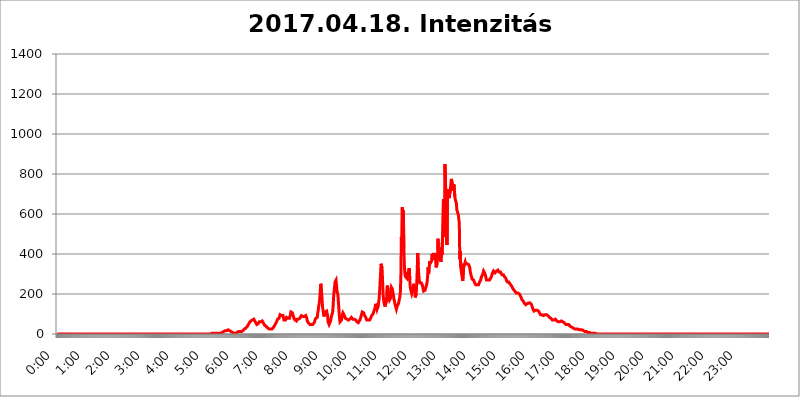
| Category | 2017.04.18. Intenzitás [W/m^2] |
|---|---|
| 0.0 | 0 |
| 0.0006944444444444445 | 0 |
| 0.001388888888888889 | 0 |
| 0.0020833333333333333 | 0 |
| 0.002777777777777778 | 0 |
| 0.003472222222222222 | 0 |
| 0.004166666666666667 | 0 |
| 0.004861111111111111 | 0 |
| 0.005555555555555556 | 0 |
| 0.0062499999999999995 | 0 |
| 0.006944444444444444 | 0 |
| 0.007638888888888889 | 0 |
| 0.008333333333333333 | 0 |
| 0.009027777777777779 | 0 |
| 0.009722222222222222 | 0 |
| 0.010416666666666666 | 0 |
| 0.011111111111111112 | 0 |
| 0.011805555555555555 | 0 |
| 0.012499999999999999 | 0 |
| 0.013194444444444444 | 0 |
| 0.013888888888888888 | 0 |
| 0.014583333333333332 | 0 |
| 0.015277777777777777 | 0 |
| 0.015972222222222224 | 0 |
| 0.016666666666666666 | 0 |
| 0.017361111111111112 | 0 |
| 0.018055555555555557 | 0 |
| 0.01875 | 0 |
| 0.019444444444444445 | 0 |
| 0.02013888888888889 | 0 |
| 0.020833333333333332 | 0 |
| 0.02152777777777778 | 0 |
| 0.022222222222222223 | 0 |
| 0.02291666666666667 | 0 |
| 0.02361111111111111 | 0 |
| 0.024305555555555556 | 0 |
| 0.024999999999999998 | 0 |
| 0.025694444444444447 | 0 |
| 0.02638888888888889 | 0 |
| 0.027083333333333334 | 0 |
| 0.027777777777777776 | 0 |
| 0.02847222222222222 | 0 |
| 0.029166666666666664 | 0 |
| 0.029861111111111113 | 0 |
| 0.030555555555555555 | 0 |
| 0.03125 | 0 |
| 0.03194444444444445 | 0 |
| 0.03263888888888889 | 0 |
| 0.03333333333333333 | 0 |
| 0.034027777777777775 | 0 |
| 0.034722222222222224 | 0 |
| 0.035416666666666666 | 0 |
| 0.036111111111111115 | 0 |
| 0.03680555555555556 | 0 |
| 0.0375 | 0 |
| 0.03819444444444444 | 0 |
| 0.03888888888888889 | 0 |
| 0.03958333333333333 | 0 |
| 0.04027777777777778 | 0 |
| 0.04097222222222222 | 0 |
| 0.041666666666666664 | 0 |
| 0.042361111111111106 | 0 |
| 0.04305555555555556 | 0 |
| 0.043750000000000004 | 0 |
| 0.044444444444444446 | 0 |
| 0.04513888888888889 | 0 |
| 0.04583333333333334 | 0 |
| 0.04652777777777778 | 0 |
| 0.04722222222222222 | 0 |
| 0.04791666666666666 | 0 |
| 0.04861111111111111 | 0 |
| 0.049305555555555554 | 0 |
| 0.049999999999999996 | 0 |
| 0.05069444444444445 | 0 |
| 0.051388888888888894 | 0 |
| 0.052083333333333336 | 0 |
| 0.05277777777777778 | 0 |
| 0.05347222222222222 | 0 |
| 0.05416666666666667 | 0 |
| 0.05486111111111111 | 0 |
| 0.05555555555555555 | 0 |
| 0.05625 | 0 |
| 0.05694444444444444 | 0 |
| 0.057638888888888885 | 0 |
| 0.05833333333333333 | 0 |
| 0.05902777777777778 | 0 |
| 0.059722222222222225 | 0 |
| 0.06041666666666667 | 0 |
| 0.061111111111111116 | 0 |
| 0.06180555555555556 | 0 |
| 0.0625 | 0 |
| 0.06319444444444444 | 0 |
| 0.06388888888888888 | 0 |
| 0.06458333333333334 | 0 |
| 0.06527777777777778 | 0 |
| 0.06597222222222222 | 0 |
| 0.06666666666666667 | 0 |
| 0.06736111111111111 | 0 |
| 0.06805555555555555 | 0 |
| 0.06874999999999999 | 0 |
| 0.06944444444444443 | 0 |
| 0.07013888888888889 | 0 |
| 0.07083333333333333 | 0 |
| 0.07152777777777779 | 0 |
| 0.07222222222222223 | 0 |
| 0.07291666666666667 | 0 |
| 0.07361111111111111 | 0 |
| 0.07430555555555556 | 0 |
| 0.075 | 0 |
| 0.07569444444444444 | 0 |
| 0.0763888888888889 | 0 |
| 0.07708333333333334 | 0 |
| 0.07777777777777778 | 0 |
| 0.07847222222222222 | 0 |
| 0.07916666666666666 | 0 |
| 0.0798611111111111 | 0 |
| 0.08055555555555556 | 0 |
| 0.08125 | 0 |
| 0.08194444444444444 | 0 |
| 0.08263888888888889 | 0 |
| 0.08333333333333333 | 0 |
| 0.08402777777777777 | 0 |
| 0.08472222222222221 | 0 |
| 0.08541666666666665 | 0 |
| 0.08611111111111112 | 0 |
| 0.08680555555555557 | 0 |
| 0.08750000000000001 | 0 |
| 0.08819444444444445 | 0 |
| 0.08888888888888889 | 0 |
| 0.08958333333333333 | 0 |
| 0.09027777777777778 | 0 |
| 0.09097222222222222 | 0 |
| 0.09166666666666667 | 0 |
| 0.09236111111111112 | 0 |
| 0.09305555555555556 | 0 |
| 0.09375 | 0 |
| 0.09444444444444444 | 0 |
| 0.09513888888888888 | 0 |
| 0.09583333333333333 | 0 |
| 0.09652777777777777 | 0 |
| 0.09722222222222222 | 0 |
| 0.09791666666666667 | 0 |
| 0.09861111111111111 | 0 |
| 0.09930555555555555 | 0 |
| 0.09999999999999999 | 0 |
| 0.10069444444444443 | 0 |
| 0.1013888888888889 | 0 |
| 0.10208333333333335 | 0 |
| 0.10277777777777779 | 0 |
| 0.10347222222222223 | 0 |
| 0.10416666666666667 | 0 |
| 0.10486111111111111 | 0 |
| 0.10555555555555556 | 0 |
| 0.10625 | 0 |
| 0.10694444444444444 | 0 |
| 0.1076388888888889 | 0 |
| 0.10833333333333334 | 0 |
| 0.10902777777777778 | 0 |
| 0.10972222222222222 | 0 |
| 0.1111111111111111 | 0 |
| 0.11180555555555556 | 0 |
| 0.11180555555555556 | 0 |
| 0.1125 | 0 |
| 0.11319444444444444 | 0 |
| 0.11388888888888889 | 0 |
| 0.11458333333333333 | 0 |
| 0.11527777777777777 | 0 |
| 0.11597222222222221 | 0 |
| 0.11666666666666665 | 0 |
| 0.1173611111111111 | 0 |
| 0.11805555555555557 | 0 |
| 0.11944444444444445 | 0 |
| 0.12013888888888889 | 0 |
| 0.12083333333333333 | 0 |
| 0.12152777777777778 | 0 |
| 0.12222222222222223 | 0 |
| 0.12291666666666667 | 0 |
| 0.12291666666666667 | 0 |
| 0.12361111111111112 | 0 |
| 0.12430555555555556 | 0 |
| 0.125 | 0 |
| 0.12569444444444444 | 0 |
| 0.12638888888888888 | 0 |
| 0.12708333333333333 | 0 |
| 0.16875 | 0 |
| 0.12847222222222224 | 0 |
| 0.12916666666666668 | 0 |
| 0.12986111111111112 | 0 |
| 0.13055555555555556 | 0 |
| 0.13125 | 0 |
| 0.13194444444444445 | 0 |
| 0.1326388888888889 | 0 |
| 0.13333333333333333 | 0 |
| 0.13402777777777777 | 0 |
| 0.13402777777777777 | 0 |
| 0.13472222222222222 | 0 |
| 0.13541666666666666 | 0 |
| 0.1361111111111111 | 0 |
| 0.13749999999999998 | 0 |
| 0.13819444444444443 | 0 |
| 0.1388888888888889 | 0 |
| 0.13958333333333334 | 0 |
| 0.14027777777777778 | 0 |
| 0.14097222222222222 | 0 |
| 0.14166666666666666 | 0 |
| 0.1423611111111111 | 0 |
| 0.14305555555555557 | 0 |
| 0.14375000000000002 | 0 |
| 0.14444444444444446 | 0 |
| 0.1451388888888889 | 0 |
| 0.1451388888888889 | 0 |
| 0.14652777777777778 | 0 |
| 0.14722222222222223 | 0 |
| 0.14791666666666667 | 0 |
| 0.1486111111111111 | 0 |
| 0.14930555555555555 | 0 |
| 0.15 | 0 |
| 0.15069444444444444 | 0 |
| 0.15138888888888888 | 0 |
| 0.15208333333333332 | 0 |
| 0.15277777777777776 | 0 |
| 0.15347222222222223 | 0 |
| 0.15416666666666667 | 0 |
| 0.15486111111111112 | 0 |
| 0.15555555555555556 | 0 |
| 0.15625 | 0 |
| 0.15694444444444444 | 0 |
| 0.15763888888888888 | 0 |
| 0.15833333333333333 | 0 |
| 0.15902777777777777 | 0 |
| 0.15972222222222224 | 0 |
| 0.16041666666666668 | 0 |
| 0.16111111111111112 | 0 |
| 0.16180555555555556 | 0 |
| 0.1625 | 0 |
| 0.16319444444444445 | 0 |
| 0.1638888888888889 | 0 |
| 0.16458333333333333 | 0 |
| 0.16527777777777777 | 0 |
| 0.16597222222222222 | 0 |
| 0.16666666666666666 | 0 |
| 0.1673611111111111 | 0 |
| 0.16805555555555554 | 0 |
| 0.16874999999999998 | 0 |
| 0.16944444444444443 | 0 |
| 0.17013888888888887 | 0 |
| 0.1708333333333333 | 0 |
| 0.17152777777777775 | 0 |
| 0.17222222222222225 | 0 |
| 0.1729166666666667 | 0 |
| 0.17361111111111113 | 0 |
| 0.17430555555555557 | 0 |
| 0.17500000000000002 | 0 |
| 0.17569444444444446 | 0 |
| 0.1763888888888889 | 0 |
| 0.17708333333333334 | 0 |
| 0.17777777777777778 | 0 |
| 0.17847222222222223 | 0 |
| 0.17916666666666667 | 0 |
| 0.1798611111111111 | 0 |
| 0.18055555555555555 | 0 |
| 0.18125 | 0 |
| 0.18194444444444444 | 0 |
| 0.1826388888888889 | 0 |
| 0.18333333333333335 | 0 |
| 0.1840277777777778 | 0 |
| 0.18472222222222223 | 0 |
| 0.18541666666666667 | 0 |
| 0.18611111111111112 | 0 |
| 0.18680555555555556 | 0 |
| 0.1875 | 0 |
| 0.18819444444444444 | 0 |
| 0.18888888888888888 | 0 |
| 0.18958333333333333 | 0 |
| 0.19027777777777777 | 0 |
| 0.1909722222222222 | 0 |
| 0.19166666666666665 | 0 |
| 0.19236111111111112 | 0 |
| 0.19305555555555554 | 0 |
| 0.19375 | 0 |
| 0.19444444444444445 | 0 |
| 0.1951388888888889 | 0 |
| 0.19583333333333333 | 0 |
| 0.19652777777777777 | 0 |
| 0.19722222222222222 | 0 |
| 0.19791666666666666 | 0 |
| 0.1986111111111111 | 0 |
| 0.19930555555555554 | 0 |
| 0.19999999999999998 | 0 |
| 0.20069444444444443 | 0 |
| 0.20138888888888887 | 0 |
| 0.2020833333333333 | 0 |
| 0.2027777777777778 | 0 |
| 0.2034722222222222 | 0 |
| 0.2041666666666667 | 0 |
| 0.20486111111111113 | 0 |
| 0.20555555555555557 | 0 |
| 0.20625000000000002 | 0 |
| 0.20694444444444446 | 0 |
| 0.2076388888888889 | 0 |
| 0.20833333333333334 | 0 |
| 0.20902777777777778 | 0 |
| 0.20972222222222223 | 0 |
| 0.21041666666666667 | 0 |
| 0.2111111111111111 | 0 |
| 0.21180555555555555 | 0 |
| 0.2125 | 0 |
| 0.21319444444444444 | 0 |
| 0.2138888888888889 | 0 |
| 0.21458333333333335 | 0 |
| 0.2152777777777778 | 0 |
| 0.21597222222222223 | 0 |
| 0.21666666666666667 | 3.525 |
| 0.21736111111111112 | 0 |
| 0.21805555555555556 | 3.525 |
| 0.21875 | 3.525 |
| 0.21944444444444444 | 3.525 |
| 0.22013888888888888 | 3.525 |
| 0.22083333333333333 | 3.525 |
| 0.22152777777777777 | 0 |
| 0.2222222222222222 | 3.525 |
| 0.22291666666666665 | 3.525 |
| 0.2236111111111111 | 3.525 |
| 0.22430555555555556 | 3.525 |
| 0.225 | 3.525 |
| 0.22569444444444445 | 3.525 |
| 0.2263888888888889 | 3.525 |
| 0.22708333333333333 | 3.525 |
| 0.22777777777777777 | 3.525 |
| 0.22847222222222222 | 3.525 |
| 0.22916666666666666 | 3.525 |
| 0.2298611111111111 | 7.887 |
| 0.23055555555555554 | 7.887 |
| 0.23124999999999998 | 7.887 |
| 0.23194444444444443 | 7.887 |
| 0.23263888888888887 | 7.887 |
| 0.2333333333333333 | 12.257 |
| 0.2340277777777778 | 12.257 |
| 0.2347222222222222 | 12.257 |
| 0.2354166666666667 | 16.636 |
| 0.23611111111111113 | 16.636 |
| 0.23680555555555557 | 16.636 |
| 0.23750000000000002 | 16.636 |
| 0.23819444444444446 | 16.636 |
| 0.2388888888888889 | 21.024 |
| 0.23958333333333334 | 21.024 |
| 0.24027777777777778 | 16.636 |
| 0.24097222222222223 | 16.636 |
| 0.24166666666666667 | 16.636 |
| 0.2423611111111111 | 16.636 |
| 0.24305555555555555 | 16.636 |
| 0.24375 | 12.257 |
| 0.24444444444444446 | 12.257 |
| 0.24513888888888888 | 12.257 |
| 0.24583333333333335 | 7.887 |
| 0.2465277777777778 | 7.887 |
| 0.24722222222222223 | 3.525 |
| 0.24791666666666667 | 3.525 |
| 0.24861111111111112 | 3.525 |
| 0.24930555555555556 | 3.525 |
| 0.25 | 3.525 |
| 0.25069444444444444 | 3.525 |
| 0.2513888888888889 | 7.887 |
| 0.2520833333333333 | 7.887 |
| 0.25277777777777777 | 7.887 |
| 0.2534722222222222 | 12.257 |
| 0.25416666666666665 | 12.257 |
| 0.2548611111111111 | 12.257 |
| 0.2555555555555556 | 12.257 |
| 0.25625000000000003 | 12.257 |
| 0.2569444444444445 | 12.257 |
| 0.2576388888888889 | 12.257 |
| 0.25833333333333336 | 12.257 |
| 0.2590277777777778 | 16.636 |
| 0.25972222222222224 | 16.636 |
| 0.2604166666666667 | 16.636 |
| 0.2611111111111111 | 21.024 |
| 0.26180555555555557 | 21.024 |
| 0.2625 | 25.419 |
| 0.26319444444444445 | 25.419 |
| 0.2638888888888889 | 29.823 |
| 0.26458333333333334 | 29.823 |
| 0.2652777777777778 | 34.234 |
| 0.2659722222222222 | 34.234 |
| 0.26666666666666666 | 38.653 |
| 0.2673611111111111 | 43.079 |
| 0.26805555555555555 | 47.511 |
| 0.26875 | 51.951 |
| 0.26944444444444443 | 56.398 |
| 0.2701388888888889 | 60.85 |
| 0.2708333333333333 | 60.85 |
| 0.27152777777777776 | 65.31 |
| 0.2722222222222222 | 65.31 |
| 0.27291666666666664 | 69.775 |
| 0.2736111111111111 | 69.775 |
| 0.2743055555555555 | 69.775 |
| 0.27499999999999997 | 69.775 |
| 0.27569444444444446 | 74.246 |
| 0.27638888888888885 | 69.775 |
| 0.27708333333333335 | 65.31 |
| 0.2777777777777778 | 60.85 |
| 0.27847222222222223 | 56.398 |
| 0.2791666666666667 | 51.951 |
| 0.2798611111111111 | 47.511 |
| 0.28055555555555556 | 47.511 |
| 0.28125 | 47.511 |
| 0.28194444444444444 | 51.951 |
| 0.2826388888888889 | 56.398 |
| 0.2833333333333333 | 60.85 |
| 0.28402777777777777 | 60.85 |
| 0.2847222222222222 | 60.85 |
| 0.28541666666666665 | 60.85 |
| 0.28611111111111115 | 60.85 |
| 0.28680555555555554 | 65.31 |
| 0.28750000000000003 | 65.31 |
| 0.2881944444444445 | 65.31 |
| 0.2888888888888889 | 60.85 |
| 0.28958333333333336 | 51.951 |
| 0.2902777777777778 | 47.511 |
| 0.29097222222222224 | 43.079 |
| 0.2916666666666667 | 38.653 |
| 0.2923611111111111 | 38.653 |
| 0.29305555555555557 | 38.653 |
| 0.29375 | 38.653 |
| 0.29444444444444445 | 34.234 |
| 0.2951388888888889 | 29.823 |
| 0.29583333333333334 | 29.823 |
| 0.2965277777777778 | 29.823 |
| 0.2972222222222222 | 25.419 |
| 0.29791666666666666 | 25.419 |
| 0.2986111111111111 | 25.419 |
| 0.29930555555555555 | 25.419 |
| 0.3 | 25.419 |
| 0.30069444444444443 | 25.419 |
| 0.3013888888888889 | 25.419 |
| 0.3020833333333333 | 29.823 |
| 0.30277777777777776 | 29.823 |
| 0.3034722222222222 | 34.234 |
| 0.30416666666666664 | 38.653 |
| 0.3048611111111111 | 43.079 |
| 0.3055555555555555 | 47.511 |
| 0.30624999999999997 | 51.951 |
| 0.3069444444444444 | 56.398 |
| 0.3076388888888889 | 60.85 |
| 0.30833333333333335 | 65.31 |
| 0.3090277777777778 | 74.246 |
| 0.30972222222222223 | 74.246 |
| 0.3104166666666667 | 78.722 |
| 0.3111111111111111 | 78.722 |
| 0.31180555555555556 | 87.692 |
| 0.3125 | 96.682 |
| 0.31319444444444444 | 96.682 |
| 0.3138888888888889 | 96.682 |
| 0.3145833333333333 | 92.184 |
| 0.31527777777777777 | 92.184 |
| 0.3159722222222222 | 92.184 |
| 0.31666666666666665 | 92.184 |
| 0.31736111111111115 | 78.722 |
| 0.31805555555555554 | 69.775 |
| 0.31875000000000003 | 65.31 |
| 0.3194444444444445 | 65.31 |
| 0.3201388888888889 | 69.775 |
| 0.32083333333333336 | 74.246 |
| 0.3215277777777778 | 83.205 |
| 0.32222222222222224 | 83.205 |
| 0.3229166666666667 | 83.205 |
| 0.3236111111111111 | 78.722 |
| 0.32430555555555557 | 78.722 |
| 0.325 | 74.246 |
| 0.32569444444444445 | 78.722 |
| 0.3263888888888889 | 87.692 |
| 0.32708333333333334 | 96.682 |
| 0.3277777777777778 | 110.201 |
| 0.3284722222222222 | 114.716 |
| 0.32916666666666666 | 110.201 |
| 0.3298611111111111 | 105.69 |
| 0.33055555555555555 | 101.184 |
| 0.33125 | 87.692 |
| 0.33194444444444443 | 78.722 |
| 0.3326388888888889 | 74.246 |
| 0.3333333333333333 | 69.775 |
| 0.3340277777777778 | 65.31 |
| 0.3347222222222222 | 65.31 |
| 0.3354166666666667 | 65.31 |
| 0.3361111111111111 | 74.246 |
| 0.3368055555555556 | 74.246 |
| 0.33749999999999997 | 74.246 |
| 0.33819444444444446 | 74.246 |
| 0.33888888888888885 | 78.722 |
| 0.33958333333333335 | 74.246 |
| 0.34027777777777773 | 78.722 |
| 0.34097222222222223 | 83.205 |
| 0.3416666666666666 | 83.205 |
| 0.3423611111111111 | 92.184 |
| 0.3430555555555555 | 92.184 |
| 0.34375 | 87.692 |
| 0.3444444444444445 | 87.692 |
| 0.3451388888888889 | 83.205 |
| 0.3458333333333334 | 87.692 |
| 0.34652777777777777 | 87.692 |
| 0.34722222222222227 | 92.184 |
| 0.34791666666666665 | 92.184 |
| 0.34861111111111115 | 92.184 |
| 0.34930555555555554 | 92.184 |
| 0.35000000000000003 | 78.722 |
| 0.3506944444444444 | 65.31 |
| 0.3513888888888889 | 60.85 |
| 0.3520833333333333 | 56.398 |
| 0.3527777777777778 | 56.398 |
| 0.3534722222222222 | 51.951 |
| 0.3541666666666667 | 47.511 |
| 0.3548611111111111 | 47.511 |
| 0.35555555555555557 | 47.511 |
| 0.35625 | 47.511 |
| 0.35694444444444445 | 47.511 |
| 0.3576388888888889 | 51.951 |
| 0.35833333333333334 | 47.511 |
| 0.3590277777777778 | 47.511 |
| 0.3597222222222222 | 51.951 |
| 0.36041666666666666 | 56.398 |
| 0.3611111111111111 | 65.31 |
| 0.36180555555555555 | 69.775 |
| 0.3625 | 78.722 |
| 0.36319444444444443 | 78.722 |
| 0.3638888888888889 | 78.722 |
| 0.3645833333333333 | 83.205 |
| 0.3652777777777778 | 101.184 |
| 0.3659722222222222 | 119.235 |
| 0.3666666666666667 | 137.347 |
| 0.3673611111111111 | 150.964 |
| 0.3680555555555556 | 173.709 |
| 0.36874999999999997 | 205.62 |
| 0.36944444444444446 | 251.251 |
| 0.37013888888888885 | 242.127 |
| 0.37083333333333335 | 205.62 |
| 0.37152777777777773 | 164.605 |
| 0.37222222222222223 | 132.814 |
| 0.3729166666666666 | 114.716 |
| 0.3736111111111111 | 96.682 |
| 0.3743055555555555 | 87.692 |
| 0.375 | 92.184 |
| 0.3756944444444445 | 110.201 |
| 0.3763888888888889 | 110.201 |
| 0.3770833333333334 | 105.69 |
| 0.37777777777777777 | 114.716 |
| 0.37847222222222227 | 119.235 |
| 0.37916666666666665 | 92.184 |
| 0.37986111111111115 | 60.85 |
| 0.38055555555555554 | 56.398 |
| 0.38125000000000003 | 47.511 |
| 0.3819444444444444 | 47.511 |
| 0.3826388888888889 | 51.951 |
| 0.3833333333333333 | 65.31 |
| 0.3840277777777778 | 78.722 |
| 0.3847222222222222 | 92.184 |
| 0.3854166666666667 | 96.682 |
| 0.3861111111111111 | 105.69 |
| 0.38680555555555557 | 132.814 |
| 0.3875 | 178.264 |
| 0.38819444444444445 | 210.182 |
| 0.3888888888888889 | 233 |
| 0.38958333333333334 | 260.373 |
| 0.3902777777777778 | 264.932 |
| 0.3909722222222222 | 269.49 |
| 0.39166666666666666 | 242.127 |
| 0.3923611111111111 | 214.746 |
| 0.39305555555555555 | 205.62 |
| 0.39375 | 191.937 |
| 0.39444444444444443 | 155.509 |
| 0.3951388888888889 | 119.235 |
| 0.3958333333333333 | 83.205 |
| 0.3965277777777778 | 60.85 |
| 0.3972222222222222 | 60.85 |
| 0.3979166666666667 | 60.85 |
| 0.3986111111111111 | 69.775 |
| 0.3993055555555556 | 83.205 |
| 0.39999999999999997 | 96.682 |
| 0.40069444444444446 | 105.69 |
| 0.40138888888888885 | 110.201 |
| 0.40208333333333335 | 105.69 |
| 0.40277777777777773 | 92.184 |
| 0.40347222222222223 | 87.692 |
| 0.4041666666666666 | 78.722 |
| 0.4048611111111111 | 74.246 |
| 0.4055555555555555 | 74.246 |
| 0.40625 | 74.246 |
| 0.4069444444444445 | 74.246 |
| 0.4076388888888889 | 78.722 |
| 0.4083333333333334 | 69.775 |
| 0.40902777777777777 | 74.246 |
| 0.40972222222222227 | 74.246 |
| 0.41041666666666665 | 74.246 |
| 0.41111111111111115 | 74.246 |
| 0.41180555555555554 | 78.722 |
| 0.41250000000000003 | 83.205 |
| 0.4131944444444444 | 83.205 |
| 0.4138888888888889 | 78.722 |
| 0.4145833333333333 | 74.246 |
| 0.4152777777777778 | 74.246 |
| 0.4159722222222222 | 78.722 |
| 0.4166666666666667 | 74.246 |
| 0.4173611111111111 | 74.246 |
| 0.41805555555555557 | 74.246 |
| 0.41875 | 69.775 |
| 0.41944444444444445 | 65.31 |
| 0.4201388888888889 | 60.85 |
| 0.42083333333333334 | 56.398 |
| 0.4215277777777778 | 56.398 |
| 0.4222222222222222 | 56.398 |
| 0.42291666666666666 | 56.398 |
| 0.4236111111111111 | 65.31 |
| 0.42430555555555555 | 69.775 |
| 0.425 | 74.246 |
| 0.42569444444444443 | 74.246 |
| 0.4263888888888889 | 92.184 |
| 0.4270833333333333 | 101.184 |
| 0.4277777777777778 | 110.201 |
| 0.4284722222222222 | 114.716 |
| 0.4291666666666667 | 110.201 |
| 0.4298611111111111 | 105.69 |
| 0.4305555555555556 | 96.682 |
| 0.43124999999999997 | 92.184 |
| 0.43194444444444446 | 92.184 |
| 0.43263888888888885 | 83.205 |
| 0.43333333333333335 | 78.722 |
| 0.43402777777777773 | 69.775 |
| 0.43472222222222223 | 65.31 |
| 0.4354166666666666 | 65.31 |
| 0.4361111111111111 | 69.775 |
| 0.4368055555555555 | 69.775 |
| 0.4375 | 69.775 |
| 0.4381944444444445 | 69.775 |
| 0.4388888888888889 | 74.246 |
| 0.4395833333333334 | 78.722 |
| 0.44027777777777777 | 83.205 |
| 0.44097222222222227 | 92.184 |
| 0.44166666666666665 | 96.682 |
| 0.44236111111111115 | 96.682 |
| 0.44305555555555554 | 101.184 |
| 0.44375000000000003 | 110.201 |
| 0.4444444444444444 | 110.201 |
| 0.4451388888888889 | 114.716 |
| 0.4458333333333333 | 132.814 |
| 0.4465277777777778 | 150.964 |
| 0.4472222222222222 | 155.509 |
| 0.4479166666666667 | 137.347 |
| 0.4486111111111111 | 123.758 |
| 0.44930555555555557 | 128.284 |
| 0.45 | 137.347 |
| 0.45069444444444445 | 155.509 |
| 0.4513888888888889 | 173.709 |
| 0.45208333333333334 | 210.182 |
| 0.4527777777777778 | 255.813 |
| 0.4534722222222222 | 301.354 |
| 0.45416666666666666 | 351.198 |
| 0.4548611111111111 | 351.198 |
| 0.45555555555555555 | 328.584 |
| 0.45625 | 269.49 |
| 0.45694444444444443 | 201.058 |
| 0.4576388888888889 | 173.709 |
| 0.4583333333333333 | 155.509 |
| 0.4590277777777778 | 146.423 |
| 0.4597222222222222 | 137.347 |
| 0.4604166666666667 | 137.347 |
| 0.4611111111111111 | 141.884 |
| 0.4618055555555556 | 169.156 |
| 0.46249999999999997 | 233 |
| 0.46319444444444446 | 242.127 |
| 0.46388888888888885 | 223.873 |
| 0.46458333333333335 | 191.937 |
| 0.46527777777777773 | 178.264 |
| 0.46597222222222223 | 169.156 |
| 0.4666666666666666 | 169.156 |
| 0.4673611111111111 | 178.264 |
| 0.4680555555555555 | 205.62 |
| 0.46875 | 233 |
| 0.4694444444444445 | 228.436 |
| 0.4701388888888889 | 223.873 |
| 0.4708333333333334 | 205.62 |
| 0.47152777777777777 | 191.937 |
| 0.47222222222222227 | 173.709 |
| 0.47291666666666665 | 164.605 |
| 0.47361111111111115 | 150.964 |
| 0.47430555555555554 | 141.884 |
| 0.47500000000000003 | 137.347 |
| 0.4756944444444444 | 123.758 |
| 0.4763888888888889 | 128.284 |
| 0.4770833333333333 | 141.884 |
| 0.4777777777777778 | 146.423 |
| 0.4784722222222222 | 150.964 |
| 0.4791666666666667 | 155.509 |
| 0.4798611111111111 | 173.709 |
| 0.48055555555555557 | 187.378 |
| 0.48125 | 210.182 |
| 0.48194444444444445 | 292.259 |
| 0.4826388888888889 | 484.735 |
| 0.48333333333333334 | 418.492 |
| 0.4840277777777778 | 634.105 |
| 0.4847222222222222 | 467.187 |
| 0.48541666666666666 | 617.436 |
| 0.4861111111111111 | 427.39 |
| 0.48680555555555555 | 346.682 |
| 0.4875 | 305.898 |
| 0.48819444444444443 | 287.709 |
| 0.4888888888888889 | 283.156 |
| 0.4895833333333333 | 287.709 |
| 0.4902777777777778 | 278.603 |
| 0.4909722222222222 | 278.603 |
| 0.4916666666666667 | 310.44 |
| 0.4923611111111111 | 301.354 |
| 0.4930555555555556 | 305.898 |
| 0.49374999999999997 | 328.584 |
| 0.49444444444444446 | 269.49 |
| 0.49513888888888885 | 233 |
| 0.49583333333333335 | 228.436 |
| 0.49652777777777773 | 210.182 |
| 0.49722222222222223 | 201.058 |
| 0.4979166666666666 | 201.058 |
| 0.4986111111111111 | 219.309 |
| 0.4993055555555555 | 228.436 |
| 0.5 | 251.251 |
| 0.5006944444444444 | 251.251 |
| 0.5013888888888889 | 214.746 |
| 0.5020833333333333 | 182.82 |
| 0.5027777777777778 | 178.264 |
| 0.5034722222222222 | 201.058 |
| 0.5041666666666667 | 251.251 |
| 0.5048611111111111 | 314.98 |
| 0.5055555555555555 | 405.108 |
| 0.50625 | 346.682 |
| 0.5069444444444444 | 301.354 |
| 0.5076388888888889 | 269.49 |
| 0.5083333333333333 | 255.813 |
| 0.5090277777777777 | 251.251 |
| 0.5097222222222222 | 255.813 |
| 0.5104166666666666 | 255.813 |
| 0.5111111111111112 | 255.813 |
| 0.5118055555555555 | 246.689 |
| 0.5125000000000001 | 237.564 |
| 0.5131944444444444 | 223.873 |
| 0.513888888888889 | 214.746 |
| 0.5145833333333333 | 210.182 |
| 0.5152777777777778 | 210.182 |
| 0.5159722222222222 | 219.309 |
| 0.5166666666666667 | 228.436 |
| 0.517361111111111 | 237.564 |
| 0.5180555555555556 | 246.689 |
| 0.5187499999999999 | 260.373 |
| 0.5194444444444445 | 287.709 |
| 0.5201388888888888 | 333.113 |
| 0.5208333333333334 | 301.354 |
| 0.5215277777777778 | 319.517 |
| 0.5222222222222223 | 364.728 |
| 0.5229166666666667 | 351.198 |
| 0.5236111111111111 | 355.712 |
| 0.5243055555555556 | 355.712 |
| 0.525 | 364.728 |
| 0.5256944444444445 | 400.638 |
| 0.5263888888888889 | 387.202 |
| 0.5270833333333333 | 396.164 |
| 0.5277777777777778 | 405.108 |
| 0.5284722222222222 | 387.202 |
| 0.5291666666666667 | 369.23 |
| 0.5298611111111111 | 405.108 |
| 0.5305555555555556 | 387.202 |
| 0.53125 | 333.113 |
| 0.5319444444444444 | 333.113 |
| 0.5326388888888889 | 351.198 |
| 0.5333333333333333 | 378.224 |
| 0.5340277777777778 | 475.972 |
| 0.5347222222222222 | 400.638 |
| 0.5354166666666667 | 387.202 |
| 0.5361111111111111 | 387.202 |
| 0.5368055555555555 | 387.202 |
| 0.5375 | 373.729 |
| 0.5381944444444444 | 360.221 |
| 0.5388888888888889 | 431.833 |
| 0.5395833333333333 | 396.164 |
| 0.5402777777777777 | 471.582 |
| 0.5409722222222222 | 596.45 |
| 0.5416666666666666 | 675.311 |
| 0.5423611111111112 | 484.735 |
| 0.5430555555555555 | 510.885 |
| 0.5437500000000001 | 849.199 |
| 0.5444444444444444 | 849.199 |
| 0.545138888888889 | 675.311 |
| 0.5458333333333333 | 691.608 |
| 0.5465277777777778 | 445.129 |
| 0.5472222222222222 | 667.123 |
| 0.5479166666666667 | 723.889 |
| 0.548611111111111 | 719.877 |
| 0.5493055555555556 | 679.395 |
| 0.5499999999999999 | 675.311 |
| 0.5506944444444445 | 679.395 |
| 0.5513888888888888 | 719.877 |
| 0.5520833333333334 | 751.803 |
| 0.5527777777777778 | 775.492 |
| 0.5534722222222223 | 775.492 |
| 0.5541666666666667 | 747.834 |
| 0.5548611111111111 | 751.803 |
| 0.5555555555555556 | 715.858 |
| 0.55625 | 747.834 |
| 0.5569444444444445 | 743.859 |
| 0.5576388888888889 | 687.544 |
| 0.5583333333333333 | 671.22 |
| 0.5590277777777778 | 667.123 |
| 0.5597222222222222 | 654.791 |
| 0.5604166666666667 | 621.613 |
| 0.5611111111111111 | 613.252 |
| 0.5618055555555556 | 609.062 |
| 0.5625 | 596.45 |
| 0.5631944444444444 | 575.299 |
| 0.5638888888888889 | 553.986 |
| 0.5645833333333333 | 373.729 |
| 0.5652777777777778 | 414.035 |
| 0.5659722222222222 | 333.113 |
| 0.5666666666666667 | 328.584 |
| 0.5673611111111111 | 296.808 |
| 0.5680555555555555 | 296.808 |
| 0.56875 | 264.932 |
| 0.5694444444444444 | 269.49 |
| 0.5701388888888889 | 351.198 |
| 0.5708333333333333 | 342.162 |
| 0.5715277777777777 | 351.198 |
| 0.5722222222222222 | 360.221 |
| 0.5729166666666666 | 351.198 |
| 0.5736111111111112 | 351.198 |
| 0.5743055555555555 | 355.712 |
| 0.5750000000000001 | 351.198 |
| 0.5756944444444444 | 355.712 |
| 0.576388888888889 | 351.198 |
| 0.5770833333333333 | 346.682 |
| 0.5777777777777778 | 346.682 |
| 0.5784722222222222 | 333.113 |
| 0.5791666666666667 | 314.98 |
| 0.579861111111111 | 301.354 |
| 0.5805555555555556 | 292.259 |
| 0.5812499999999999 | 283.156 |
| 0.5819444444444445 | 274.047 |
| 0.5826388888888888 | 269.49 |
| 0.5833333333333334 | 269.49 |
| 0.5840277777777778 | 269.49 |
| 0.5847222222222223 | 264.932 |
| 0.5854166666666667 | 255.813 |
| 0.5861111111111111 | 251.251 |
| 0.5868055555555556 | 246.689 |
| 0.5875 | 246.689 |
| 0.5881944444444445 | 242.127 |
| 0.5888888888888889 | 246.689 |
| 0.5895833333333333 | 246.689 |
| 0.5902777777777778 | 246.689 |
| 0.5909722222222222 | 246.689 |
| 0.5916666666666667 | 251.251 |
| 0.5923611111111111 | 260.373 |
| 0.5930555555555556 | 264.932 |
| 0.59375 | 269.49 |
| 0.5944444444444444 | 278.603 |
| 0.5951388888888889 | 287.709 |
| 0.5958333333333333 | 292.259 |
| 0.5965277777777778 | 296.808 |
| 0.5972222222222222 | 305.898 |
| 0.5979166666666667 | 314.98 |
| 0.5986111111111111 | 314.98 |
| 0.5993055555555555 | 305.898 |
| 0.6 | 305.898 |
| 0.6006944444444444 | 292.259 |
| 0.6013888888888889 | 278.603 |
| 0.6020833333333333 | 269.49 |
| 0.6027777777777777 | 269.49 |
| 0.6034722222222222 | 264.932 |
| 0.6041666666666666 | 269.49 |
| 0.6048611111111112 | 264.932 |
| 0.6055555555555555 | 269.49 |
| 0.6062500000000001 | 269.49 |
| 0.6069444444444444 | 274.047 |
| 0.607638888888889 | 278.603 |
| 0.6083333333333333 | 283.156 |
| 0.6090277777777778 | 287.709 |
| 0.6097222222222222 | 292.259 |
| 0.6104166666666667 | 305.898 |
| 0.611111111111111 | 310.44 |
| 0.6118055555555556 | 314.98 |
| 0.6124999999999999 | 310.44 |
| 0.6131944444444445 | 310.44 |
| 0.6138888888888888 | 305.898 |
| 0.6145833333333334 | 305.898 |
| 0.6152777777777778 | 310.44 |
| 0.6159722222222223 | 314.98 |
| 0.6166666666666667 | 310.44 |
| 0.6173611111111111 | 314.98 |
| 0.6180555555555556 | 319.517 |
| 0.61875 | 314.98 |
| 0.6194444444444445 | 310.44 |
| 0.6201388888888889 | 314.98 |
| 0.6208333333333333 | 310.44 |
| 0.6215277777777778 | 310.44 |
| 0.6222222222222222 | 305.898 |
| 0.6229166666666667 | 305.898 |
| 0.6236111111111111 | 296.808 |
| 0.6243055555555556 | 292.259 |
| 0.625 | 292.259 |
| 0.6256944444444444 | 296.808 |
| 0.6263888888888889 | 296.808 |
| 0.6270833333333333 | 287.709 |
| 0.6277777777777778 | 287.709 |
| 0.6284722222222222 | 287.709 |
| 0.6291666666666667 | 278.603 |
| 0.6298611111111111 | 269.49 |
| 0.6305555555555555 | 264.932 |
| 0.63125 | 260.373 |
| 0.6319444444444444 | 260.373 |
| 0.6326388888888889 | 260.373 |
| 0.6333333333333333 | 260.373 |
| 0.6340277777777777 | 255.813 |
| 0.6347222222222222 | 251.251 |
| 0.6354166666666666 | 251.251 |
| 0.6361111111111112 | 246.689 |
| 0.6368055555555555 | 242.127 |
| 0.6375000000000001 | 237.564 |
| 0.6381944444444444 | 233 |
| 0.638888888888889 | 228.436 |
| 0.6395833333333333 | 223.873 |
| 0.6402777777777778 | 219.309 |
| 0.6409722222222222 | 219.309 |
| 0.6416666666666667 | 214.746 |
| 0.642361111111111 | 210.182 |
| 0.6430555555555556 | 210.182 |
| 0.6437499999999999 | 205.62 |
| 0.6444444444444445 | 210.182 |
| 0.6451388888888888 | 205.62 |
| 0.6458333333333334 | 205.62 |
| 0.6465277777777778 | 205.62 |
| 0.6472222222222223 | 201.058 |
| 0.6479166666666667 | 201.058 |
| 0.6486111111111111 | 196.497 |
| 0.6493055555555556 | 191.937 |
| 0.65 | 187.378 |
| 0.6506944444444445 | 182.82 |
| 0.6513888888888889 | 173.709 |
| 0.6520833333333333 | 173.709 |
| 0.6527777777777778 | 169.156 |
| 0.6534722222222222 | 164.605 |
| 0.6541666666666667 | 160.056 |
| 0.6548611111111111 | 155.509 |
| 0.6555555555555556 | 150.964 |
| 0.65625 | 150.964 |
| 0.6569444444444444 | 146.423 |
| 0.6576388888888889 | 146.423 |
| 0.6583333333333333 | 146.423 |
| 0.6590277777777778 | 150.964 |
| 0.6597222222222222 | 155.509 |
| 0.6604166666666667 | 155.509 |
| 0.6611111111111111 | 155.509 |
| 0.6618055555555555 | 160.056 |
| 0.6625 | 160.056 |
| 0.6631944444444444 | 155.509 |
| 0.6638888888888889 | 155.509 |
| 0.6645833333333333 | 150.964 |
| 0.6652777777777777 | 146.423 |
| 0.6659722222222222 | 137.347 |
| 0.6666666666666666 | 132.814 |
| 0.6673611111111111 | 123.758 |
| 0.6680555555555556 | 119.235 |
| 0.6687500000000001 | 114.716 |
| 0.6694444444444444 | 114.716 |
| 0.6701388888888888 | 114.716 |
| 0.6708333333333334 | 119.235 |
| 0.6715277777777778 | 119.235 |
| 0.6722222222222222 | 119.235 |
| 0.6729166666666666 | 119.235 |
| 0.6736111111111112 | 119.235 |
| 0.6743055555555556 | 119.235 |
| 0.6749999999999999 | 114.716 |
| 0.6756944444444444 | 110.201 |
| 0.6763888888888889 | 105.69 |
| 0.6770833333333334 | 101.184 |
| 0.6777777777777777 | 96.682 |
| 0.6784722222222223 | 92.184 |
| 0.6791666666666667 | 92.184 |
| 0.6798611111111111 | 96.682 |
| 0.6805555555555555 | 92.184 |
| 0.68125 | 92.184 |
| 0.6819444444444445 | 92.184 |
| 0.6826388888888889 | 92.184 |
| 0.6833333333333332 | 92.184 |
| 0.6840277777777778 | 96.682 |
| 0.6847222222222222 | 96.682 |
| 0.6854166666666667 | 96.682 |
| 0.686111111111111 | 96.682 |
| 0.6868055555555556 | 96.682 |
| 0.6875 | 92.184 |
| 0.6881944444444444 | 92.184 |
| 0.688888888888889 | 92.184 |
| 0.6895833333333333 | 87.692 |
| 0.6902777777777778 | 83.205 |
| 0.6909722222222222 | 83.205 |
| 0.6916666666666668 | 83.205 |
| 0.6923611111111111 | 78.722 |
| 0.6930555555555555 | 74.246 |
| 0.69375 | 74.246 |
| 0.6944444444444445 | 69.775 |
| 0.6951388888888889 | 69.775 |
| 0.6958333333333333 | 69.775 |
| 0.6965277777777777 | 69.775 |
| 0.6972222222222223 | 74.246 |
| 0.6979166666666666 | 74.246 |
| 0.6986111111111111 | 74.246 |
| 0.6993055555555556 | 74.246 |
| 0.7000000000000001 | 69.775 |
| 0.7006944444444444 | 65.31 |
| 0.7013888888888888 | 65.31 |
| 0.7020833333333334 | 60.85 |
| 0.7027777777777778 | 60.85 |
| 0.7034722222222222 | 60.85 |
| 0.7041666666666666 | 60.85 |
| 0.7048611111111112 | 60.85 |
| 0.7055555555555556 | 65.31 |
| 0.7062499999999999 | 65.31 |
| 0.7069444444444444 | 65.31 |
| 0.7076388888888889 | 65.31 |
| 0.7083333333333334 | 65.31 |
| 0.7090277777777777 | 60.85 |
| 0.7097222222222223 | 60.85 |
| 0.7104166666666667 | 56.398 |
| 0.7111111111111111 | 56.398 |
| 0.7118055555555555 | 51.951 |
| 0.7125 | 51.951 |
| 0.7131944444444445 | 47.511 |
| 0.7138888888888889 | 47.511 |
| 0.7145833333333332 | 47.511 |
| 0.7152777777777778 | 47.511 |
| 0.7159722222222222 | 47.511 |
| 0.7166666666666667 | 47.511 |
| 0.717361111111111 | 47.511 |
| 0.7180555555555556 | 43.079 |
| 0.71875 | 43.079 |
| 0.7194444444444444 | 38.653 |
| 0.720138888888889 | 34.234 |
| 0.7208333333333333 | 34.234 |
| 0.7215277777777778 | 34.234 |
| 0.7222222222222222 | 29.823 |
| 0.7229166666666668 | 29.823 |
| 0.7236111111111111 | 29.823 |
| 0.7243055555555555 | 25.419 |
| 0.725 | 25.419 |
| 0.7256944444444445 | 25.419 |
| 0.7263888888888889 | 25.419 |
| 0.7270833333333333 | 25.419 |
| 0.7277777777777777 | 25.419 |
| 0.7284722222222223 | 25.419 |
| 0.7291666666666666 | 25.419 |
| 0.7298611111111111 | 25.419 |
| 0.7305555555555556 | 25.419 |
| 0.7312500000000001 | 21.024 |
| 0.7319444444444444 | 21.024 |
| 0.7326388888888888 | 21.024 |
| 0.7333333333333334 | 21.024 |
| 0.7340277777777778 | 21.024 |
| 0.7347222222222222 | 21.024 |
| 0.7354166666666666 | 21.024 |
| 0.7361111111111112 | 21.024 |
| 0.7368055555555556 | 21.024 |
| 0.7374999999999999 | 21.024 |
| 0.7381944444444444 | 16.636 |
| 0.7388888888888889 | 16.636 |
| 0.7395833333333334 | 12.257 |
| 0.7402777777777777 | 12.257 |
| 0.7409722222222223 | 12.257 |
| 0.7416666666666667 | 12.257 |
| 0.7423611111111111 | 12.257 |
| 0.7430555555555555 | 12.257 |
| 0.74375 | 7.887 |
| 0.7444444444444445 | 7.887 |
| 0.7451388888888889 | 7.887 |
| 0.7458333333333332 | 7.887 |
| 0.7465277777777778 | 7.887 |
| 0.7472222222222222 | 3.525 |
| 0.7479166666666667 | 3.525 |
| 0.748611111111111 | 3.525 |
| 0.7493055555555556 | 3.525 |
| 0.75 | 3.525 |
| 0.7506944444444444 | 3.525 |
| 0.751388888888889 | 3.525 |
| 0.7520833333333333 | 3.525 |
| 0.7527777777777778 | 3.525 |
| 0.7534722222222222 | 3.525 |
| 0.7541666666666668 | 3.525 |
| 0.7548611111111111 | 3.525 |
| 0.7555555555555555 | 3.525 |
| 0.75625 | 3.525 |
| 0.7569444444444445 | 0 |
| 0.7576388888888889 | 0 |
| 0.7583333333333333 | 0 |
| 0.7590277777777777 | 0 |
| 0.7597222222222223 | 0 |
| 0.7604166666666666 | 0 |
| 0.7611111111111111 | 0 |
| 0.7618055555555556 | 0 |
| 0.7625000000000001 | 0 |
| 0.7631944444444444 | 0 |
| 0.7638888888888888 | 0 |
| 0.7645833333333334 | 0 |
| 0.7652777777777778 | 0 |
| 0.7659722222222222 | 0 |
| 0.7666666666666666 | 0 |
| 0.7673611111111112 | 0 |
| 0.7680555555555556 | 0 |
| 0.7687499999999999 | 0 |
| 0.7694444444444444 | 0 |
| 0.7701388888888889 | 0 |
| 0.7708333333333334 | 0 |
| 0.7715277777777777 | 0 |
| 0.7722222222222223 | 0 |
| 0.7729166666666667 | 0 |
| 0.7736111111111111 | 0 |
| 0.7743055555555555 | 0 |
| 0.775 | 0 |
| 0.7756944444444445 | 0 |
| 0.7763888888888889 | 0 |
| 0.7770833333333332 | 0 |
| 0.7777777777777778 | 0 |
| 0.7784722222222222 | 0 |
| 0.7791666666666667 | 0 |
| 0.779861111111111 | 0 |
| 0.7805555555555556 | 0 |
| 0.78125 | 0 |
| 0.7819444444444444 | 0 |
| 0.782638888888889 | 0 |
| 0.7833333333333333 | 0 |
| 0.7840277777777778 | 0 |
| 0.7847222222222222 | 0 |
| 0.7854166666666668 | 0 |
| 0.7861111111111111 | 0 |
| 0.7868055555555555 | 0 |
| 0.7875 | 0 |
| 0.7881944444444445 | 0 |
| 0.7888888888888889 | 0 |
| 0.7895833333333333 | 0 |
| 0.7902777777777777 | 0 |
| 0.7909722222222223 | 0 |
| 0.7916666666666666 | 0 |
| 0.7923611111111111 | 0 |
| 0.7930555555555556 | 0 |
| 0.7937500000000001 | 0 |
| 0.7944444444444444 | 0 |
| 0.7951388888888888 | 0 |
| 0.7958333333333334 | 0 |
| 0.7965277777777778 | 0 |
| 0.7972222222222222 | 0 |
| 0.7979166666666666 | 0 |
| 0.7986111111111112 | 0 |
| 0.7993055555555556 | 0 |
| 0.7999999999999999 | 0 |
| 0.8006944444444444 | 0 |
| 0.8013888888888889 | 0 |
| 0.8020833333333334 | 0 |
| 0.8027777777777777 | 0 |
| 0.8034722222222223 | 0 |
| 0.8041666666666667 | 0 |
| 0.8048611111111111 | 0 |
| 0.8055555555555555 | 0 |
| 0.80625 | 0 |
| 0.8069444444444445 | 0 |
| 0.8076388888888889 | 0 |
| 0.8083333333333332 | 0 |
| 0.8090277777777778 | 0 |
| 0.8097222222222222 | 0 |
| 0.8104166666666667 | 0 |
| 0.811111111111111 | 0 |
| 0.8118055555555556 | 0 |
| 0.8125 | 0 |
| 0.8131944444444444 | 0 |
| 0.813888888888889 | 0 |
| 0.8145833333333333 | 0 |
| 0.8152777777777778 | 0 |
| 0.8159722222222222 | 0 |
| 0.8166666666666668 | 0 |
| 0.8173611111111111 | 0 |
| 0.8180555555555555 | 0 |
| 0.81875 | 0 |
| 0.8194444444444445 | 0 |
| 0.8201388888888889 | 0 |
| 0.8208333333333333 | 0 |
| 0.8215277777777777 | 0 |
| 0.8222222222222223 | 0 |
| 0.8229166666666666 | 0 |
| 0.8236111111111111 | 0 |
| 0.8243055555555556 | 0 |
| 0.8250000000000001 | 0 |
| 0.8256944444444444 | 0 |
| 0.8263888888888888 | 0 |
| 0.8270833333333334 | 0 |
| 0.8277777777777778 | 0 |
| 0.8284722222222222 | 0 |
| 0.8291666666666666 | 0 |
| 0.8298611111111112 | 0 |
| 0.8305555555555556 | 0 |
| 0.8312499999999999 | 0 |
| 0.8319444444444444 | 0 |
| 0.8326388888888889 | 0 |
| 0.8333333333333334 | 0 |
| 0.8340277777777777 | 0 |
| 0.8347222222222223 | 0 |
| 0.8354166666666667 | 0 |
| 0.8361111111111111 | 0 |
| 0.8368055555555555 | 0 |
| 0.8375 | 0 |
| 0.8381944444444445 | 0 |
| 0.8388888888888889 | 0 |
| 0.8395833333333332 | 0 |
| 0.8402777777777778 | 0 |
| 0.8409722222222222 | 0 |
| 0.8416666666666667 | 0 |
| 0.842361111111111 | 0 |
| 0.8430555555555556 | 0 |
| 0.84375 | 0 |
| 0.8444444444444444 | 0 |
| 0.845138888888889 | 0 |
| 0.8458333333333333 | 0 |
| 0.8465277777777778 | 0 |
| 0.8472222222222222 | 0 |
| 0.8479166666666668 | 0 |
| 0.8486111111111111 | 0 |
| 0.8493055555555555 | 0 |
| 0.85 | 0 |
| 0.8506944444444445 | 0 |
| 0.8513888888888889 | 0 |
| 0.8520833333333333 | 0 |
| 0.8527777777777777 | 0 |
| 0.8534722222222223 | 0 |
| 0.8541666666666666 | 0 |
| 0.8548611111111111 | 0 |
| 0.8555555555555556 | 0 |
| 0.8562500000000001 | 0 |
| 0.8569444444444444 | 0 |
| 0.8576388888888888 | 0 |
| 0.8583333333333334 | 0 |
| 0.8590277777777778 | 0 |
| 0.8597222222222222 | 0 |
| 0.8604166666666666 | 0 |
| 0.8611111111111112 | 0 |
| 0.8618055555555556 | 0 |
| 0.8624999999999999 | 0 |
| 0.8631944444444444 | 0 |
| 0.8638888888888889 | 0 |
| 0.8645833333333334 | 0 |
| 0.8652777777777777 | 0 |
| 0.8659722222222223 | 0 |
| 0.8666666666666667 | 0 |
| 0.8673611111111111 | 0 |
| 0.8680555555555555 | 0 |
| 0.86875 | 0 |
| 0.8694444444444445 | 0 |
| 0.8701388888888889 | 0 |
| 0.8708333333333332 | 0 |
| 0.8715277777777778 | 0 |
| 0.8722222222222222 | 0 |
| 0.8729166666666667 | 0 |
| 0.873611111111111 | 0 |
| 0.8743055555555556 | 0 |
| 0.875 | 0 |
| 0.8756944444444444 | 0 |
| 0.876388888888889 | 0 |
| 0.8770833333333333 | 0 |
| 0.8777777777777778 | 0 |
| 0.8784722222222222 | 0 |
| 0.8791666666666668 | 0 |
| 0.8798611111111111 | 0 |
| 0.8805555555555555 | 0 |
| 0.88125 | 0 |
| 0.8819444444444445 | 0 |
| 0.8826388888888889 | 0 |
| 0.8833333333333333 | 0 |
| 0.8840277777777777 | 0 |
| 0.8847222222222223 | 0 |
| 0.8854166666666666 | 0 |
| 0.8861111111111111 | 0 |
| 0.8868055555555556 | 0 |
| 0.8875000000000001 | 0 |
| 0.8881944444444444 | 0 |
| 0.8888888888888888 | 0 |
| 0.8895833333333334 | 0 |
| 0.8902777777777778 | 0 |
| 0.8909722222222222 | 0 |
| 0.8916666666666666 | 0 |
| 0.8923611111111112 | 0 |
| 0.8930555555555556 | 0 |
| 0.8937499999999999 | 0 |
| 0.8944444444444444 | 0 |
| 0.8951388888888889 | 0 |
| 0.8958333333333334 | 0 |
| 0.8965277777777777 | 0 |
| 0.8972222222222223 | 0 |
| 0.8979166666666667 | 0 |
| 0.8986111111111111 | 0 |
| 0.8993055555555555 | 0 |
| 0.9 | 0 |
| 0.9006944444444445 | 0 |
| 0.9013888888888889 | 0 |
| 0.9020833333333332 | 0 |
| 0.9027777777777778 | 0 |
| 0.9034722222222222 | 0 |
| 0.9041666666666667 | 0 |
| 0.904861111111111 | 0 |
| 0.9055555555555556 | 0 |
| 0.90625 | 0 |
| 0.9069444444444444 | 0 |
| 0.907638888888889 | 0 |
| 0.9083333333333333 | 0 |
| 0.9090277777777778 | 0 |
| 0.9097222222222222 | 0 |
| 0.9104166666666668 | 0 |
| 0.9111111111111111 | 0 |
| 0.9118055555555555 | 0 |
| 0.9125 | 0 |
| 0.9131944444444445 | 0 |
| 0.9138888888888889 | 0 |
| 0.9145833333333333 | 0 |
| 0.9152777777777777 | 0 |
| 0.9159722222222223 | 0 |
| 0.9166666666666666 | 0 |
| 0.9173611111111111 | 0 |
| 0.9180555555555556 | 0 |
| 0.9187500000000001 | 0 |
| 0.9194444444444444 | 0 |
| 0.9201388888888888 | 0 |
| 0.9208333333333334 | 0 |
| 0.9215277777777778 | 0 |
| 0.9222222222222222 | 0 |
| 0.9229166666666666 | 0 |
| 0.9236111111111112 | 0 |
| 0.9243055555555556 | 0 |
| 0.9249999999999999 | 0 |
| 0.9256944444444444 | 0 |
| 0.9263888888888889 | 0 |
| 0.9270833333333334 | 0 |
| 0.9277777777777777 | 0 |
| 0.9284722222222223 | 0 |
| 0.9291666666666667 | 0 |
| 0.9298611111111111 | 0 |
| 0.9305555555555555 | 0 |
| 0.93125 | 0 |
| 0.9319444444444445 | 0 |
| 0.9326388888888889 | 0 |
| 0.9333333333333332 | 0 |
| 0.9340277777777778 | 0 |
| 0.9347222222222222 | 0 |
| 0.9354166666666667 | 0 |
| 0.936111111111111 | 0 |
| 0.9368055555555556 | 0 |
| 0.9375 | 0 |
| 0.9381944444444444 | 0 |
| 0.938888888888889 | 0 |
| 0.9395833333333333 | 0 |
| 0.9402777777777778 | 0 |
| 0.9409722222222222 | 0 |
| 0.9416666666666668 | 0 |
| 0.9423611111111111 | 0 |
| 0.9430555555555555 | 0 |
| 0.94375 | 0 |
| 0.9444444444444445 | 0 |
| 0.9451388888888889 | 0 |
| 0.9458333333333333 | 0 |
| 0.9465277777777777 | 0 |
| 0.9472222222222223 | 0 |
| 0.9479166666666666 | 0 |
| 0.9486111111111111 | 0 |
| 0.9493055555555556 | 0 |
| 0.9500000000000001 | 0 |
| 0.9506944444444444 | 0 |
| 0.9513888888888888 | 0 |
| 0.9520833333333334 | 0 |
| 0.9527777777777778 | 0 |
| 0.9534722222222222 | 0 |
| 0.9541666666666666 | 0 |
| 0.9548611111111112 | 0 |
| 0.9555555555555556 | 0 |
| 0.9562499999999999 | 0 |
| 0.9569444444444444 | 0 |
| 0.9576388888888889 | 0 |
| 0.9583333333333334 | 0 |
| 0.9590277777777777 | 0 |
| 0.9597222222222223 | 0 |
| 0.9604166666666667 | 0 |
| 0.9611111111111111 | 0 |
| 0.9618055555555555 | 0 |
| 0.9625 | 0 |
| 0.9631944444444445 | 0 |
| 0.9638888888888889 | 0 |
| 0.9645833333333332 | 0 |
| 0.9652777777777778 | 0 |
| 0.9659722222222222 | 0 |
| 0.9666666666666667 | 0 |
| 0.967361111111111 | 0 |
| 0.9680555555555556 | 0 |
| 0.96875 | 0 |
| 0.9694444444444444 | 0 |
| 0.970138888888889 | 0 |
| 0.9708333333333333 | 0 |
| 0.9715277777777778 | 0 |
| 0.9722222222222222 | 0 |
| 0.9729166666666668 | 0 |
| 0.9736111111111111 | 0 |
| 0.9743055555555555 | 0 |
| 0.975 | 0 |
| 0.9756944444444445 | 0 |
| 0.9763888888888889 | 0 |
| 0.9770833333333333 | 0 |
| 0.9777777777777777 | 0 |
| 0.9784722222222223 | 0 |
| 0.9791666666666666 | 0 |
| 0.9798611111111111 | 0 |
| 0.9805555555555556 | 0 |
| 0.9812500000000001 | 0 |
| 0.9819444444444444 | 0 |
| 0.9826388888888888 | 0 |
| 0.9833333333333334 | 0 |
| 0.9840277777777778 | 0 |
| 0.9847222222222222 | 0 |
| 0.9854166666666666 | 0 |
| 0.9861111111111112 | 0 |
| 0.9868055555555556 | 0 |
| 0.9874999999999999 | 0 |
| 0.9881944444444444 | 0 |
| 0.9888888888888889 | 0 |
| 0.9895833333333334 | 0 |
| 0.9902777777777777 | 0 |
| 0.9909722222222223 | 0 |
| 0.9916666666666667 | 0 |
| 0.9923611111111111 | 0 |
| 0.9930555555555555 | 0 |
| 0.99375 | 0 |
| 0.9944444444444445 | 0 |
| 0.9951388888888889 | 0 |
| 0.9958333333333332 | 0 |
| 0.9965277777777778 | 0 |
| 0.9972222222222222 | 0 |
| 0.9979166666666667 | 0 |
| 0.998611111111111 | 0 |
| 0.9993055555555556 | 0 |